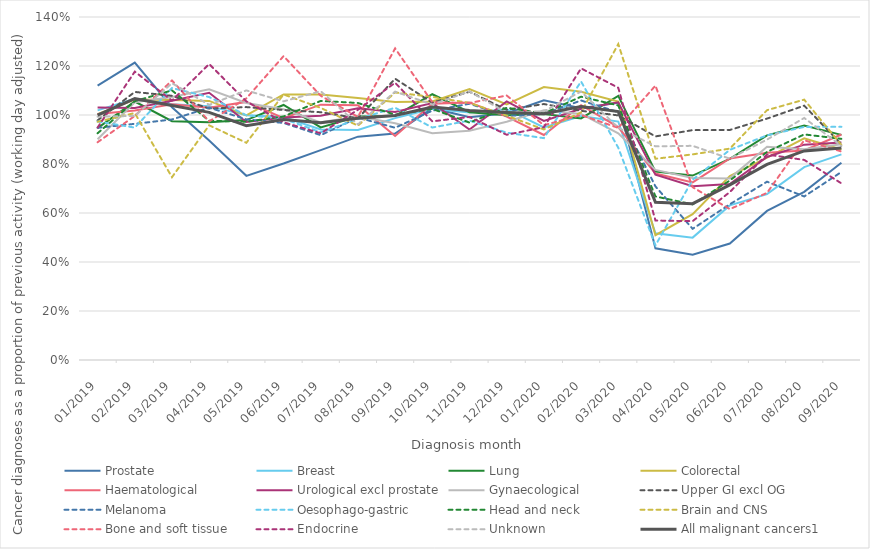
| Category | Prostate | Breast | Lung | Colorectal | Haematological | Urological excl prostate | Gynaecological | Upper GI excl OG | Melanoma | Oesophago-gastric | Head and neck | Brain and CNS | Bone and soft tissue | Endocrine | Unknown | All malignant cancers1 |
|---|---|---|---|---|---|---|---|---|---|---|---|---|---|---|---|---|
| 2019-01-01 | 1.12 | 1.019 | 0.946 | 1.003 | 1.004 | 1.031 | 0.901 | 0.978 | 0.948 | 0.973 | 0.925 | 0.973 | 0.889 | 0.949 | 0.993 | 0.999 |
| 2019-02-01 | 1.214 | 1.066 | 1.055 | 1.063 | 1.019 | 1.028 | 1.052 | 1.094 | 0.964 | 0.949 | 1.056 | 1.008 | 0.996 | 1.177 | 0.996 | 1.067 |
| 2019-03-01 | 1.032 | 1.044 | 0.975 | 1.061 | 1.044 | 1.058 | 1.073 | 1.078 | 0.982 | 1.11 | 1.1 | 0.746 | 1.141 | 1.059 | 1.13 | 1.039 |
| 2019-04-01 | 0.896 | 1.036 | 0.971 | 1.057 | 1.029 | 1.091 | 1.105 | 1.026 | 1.03 | 1.073 | 0.976 | 0.958 | 0.974 | 1.208 | 1.041 | 1.011 |
| 2019-05-01 | 0.752 | 0.999 | 0.979 | 0.998 | 1.053 | 0.972 | 1.049 | 1.032 | 0.982 | 0.999 | 0.973 | 0.886 | 1.068 | 1.056 | 1.1 | 0.957 |
| 2019-06-01 | 0.802 | 0.992 | 1.041 | 1.084 | 0.987 | 0.99 | 1.023 | 1.02 | 0.968 | 0.984 | 0.994 | 1.084 | 1.24 | 0.97 | 1.056 | 0.981 |
| 2019-07-01 | 0.857 | 0.941 | 0.949 | 1.084 | 1.042 | 0.997 | 0.97 | 1.011 | 0.918 | 0.93 | 1.057 | 1.029 | 1.079 | 0.925 | 1.097 | 0.968 |
| 2019-08-01 | 0.912 | 0.939 | 0.993 | 1.069 | 1.04 | 1.028 | 0.994 | 0.987 | 0.99 | 0.983 | 1.049 | 0.956 | 0.992 | 1.021 | 0.962 | 0.987 |
| 2019-09-01 | 0.924 | 0.987 | 0.996 | 1.053 | 0.915 | 1.012 | 0.966 | 1.148 | 0.948 | 1.03 | 1.001 | 1.092 | 1.272 | 1.132 | 1.096 | 0.998 |
| 2019-10-01 | 1.028 | 1.025 | 1.085 | 1.055 | 1.046 | 1.049 | 0.925 | 1.05 | 1.018 | 0.949 | 1.025 | 1.074 | 1.052 | 0.974 | 1.043 | 1.033 |
| 2019-11-01 | 0.991 | 1.01 | 1.011 | 1.106 | 1.051 | 0.941 | 0.936 | 1.095 | 1.046 | 0.977 | 0.969 | 1.049 | 1.049 | 0.992 | 1.096 | 1.019 |
| 2019-12-01 | 1.007 | 1.024 | 0.999 | 1.043 | 0.994 | 1.056 | 0.973 | 1.021 | 0.996 | 0.928 | 1.03 | 0.997 | 1.079 | 0.919 | 1.009 | 1.01 |
| 2020-01-01 | 1.06 | 0.95 | 1.004 | 1.114 | 0.919 | 0.976 | 1.019 | 1.045 | 1.004 | 0.906 | 1.007 | 0.941 | 0.958 | 0.95 | 1.015 | 1.005 |
| 2020-02-01 | 1.028 | 0.996 | 0.986 | 1.095 | 1.04 | 1.025 | 1.004 | 1.017 | 1.059 | 1.137 | 1.075 | 1.011 | 1 | 1.19 | 1.096 | 1.034 |
| 2020-03-01 | 1.05 | 0.973 | 1.078 | 1.055 | 0.951 | 1.052 | 0.925 | 0.998 | 1.012 | 0.867 | 1.039 | 1.29 | 0.948 | 1.111 | 0.948 | 1.014 |
| 2020-04-01 | 0.456 | 0.517 | 0.769 | 0.51 | 0.761 | 0.756 | 0.776 | 0.913 | 0.708 | 0.468 | 0.668 | 0.821 | 1.12 | 0.569 | 0.872 | 0.644 |
| 2020-05-01 | 0.43 | 0.499 | 0.753 | 0.595 | 0.725 | 0.71 | 0.743 | 0.938 | 0.535 | 0.736 | 0.635 | 0.839 | 0.705 | 0.567 | 0.874 | 0.638 |
| 2020-06-01 | 0.475 | 0.631 | 0.821 | 0.751 | 0.822 | 0.718 | 0.741 | 0.939 | 0.636 | 0.858 | 0.733 | 0.863 | 0.616 | 0.686 | 0.822 | 0.715 |
| 2020-07-01 | 0.609 | 0.677 | 0.917 | 0.826 | 0.846 | 0.829 | 0.87 | 0.985 | 0.728 | 0.917 | 0.849 | 1.02 | 0.682 | 0.839 | 0.9 | 0.798 |
| 2020-08-01 | 0.686 | 0.787 | 0.957 | 0.905 | 0.855 | 0.879 | 0.861 | 1.038 | 0.667 | 0.951 | 0.921 | 1.063 | 0.897 | 0.817 | 0.988 | 0.854 |
| 2020-09-01 | 0.805 | 0.839 | 0.919 | 0.859 | 0.92 | 0.887 | 0.88 | 0.88 | 0.768 | 0.952 | 0.903 | 0.878 | 0.851 | 0.721 | 0.874 | 0.865 |